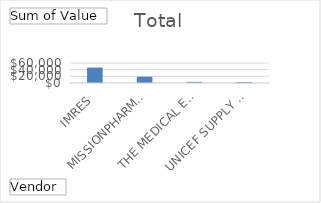
| Category | Total |
|---|---|
| IMRES | 46153.25 |
| MISSIONPHARMA A/S | 18781 |
| THE MEDICAL EXPORT GROUP BV | 3407.4 |
| UNICEF SUPPLY DIVISION | 2889.33 |